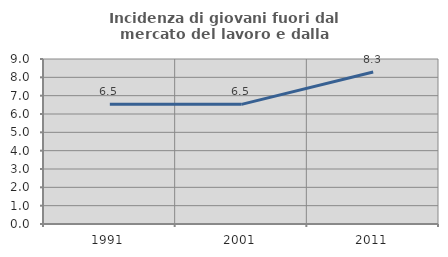
| Category | Incidenza di giovani fuori dal mercato del lavoro e dalla formazione  |
|---|---|
| 1991.0 | 6.525 |
| 2001.0 | 6.526 |
| 2011.0 | 8.291 |